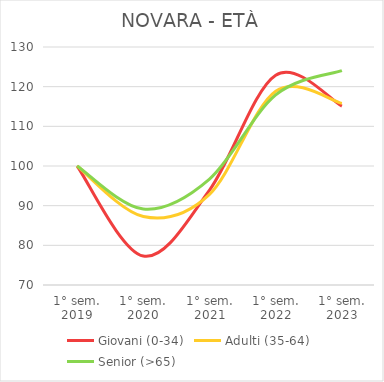
| Category | Giovani (0-34) | Adulti (35-64) | Senior (>65) |
|---|---|---|---|
| 1° sem.
2019 | 100 | 100 | 100 |
| 1° sem.
2020 | 77.295 | 87.265 | 89.151 |
| 1° sem.
2021 | 93.922 | 92.864 | 96.698 |
| 1° sem.
2022 | 122.887 | 118.831 | 117.925 |
| 1° sem.
2023 | 115.087 | 115.783 | 124.057 |